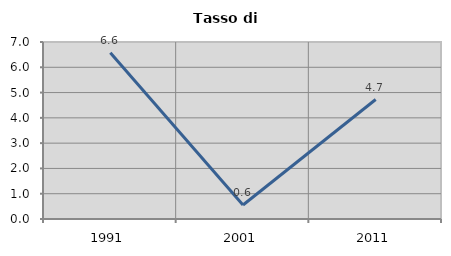
| Category | Tasso di disoccupazione   |
|---|---|
| 1991.0 | 6.571 |
| 2001.0 | 0.556 |
| 2011.0 | 4.724 |